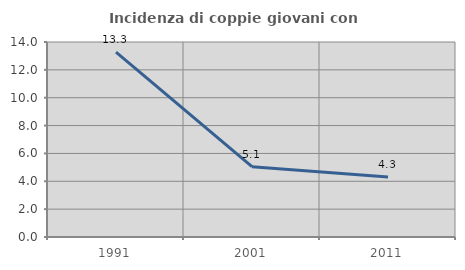
| Category | Incidenza di coppie giovani con figli |
|---|---|
| 1991.0 | 13.27 |
| 2001.0 | 5.051 |
| 2011.0 | 4.301 |